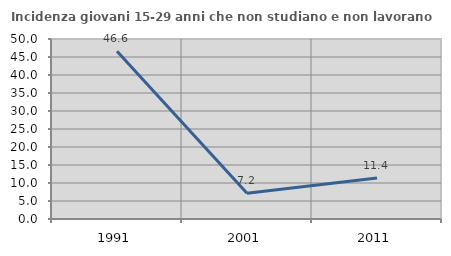
| Category | Incidenza giovani 15-29 anni che non studiano e non lavorano  |
|---|---|
| 1991.0 | 46.609 |
| 2001.0 | 7.181 |
| 2011.0 | 11.385 |